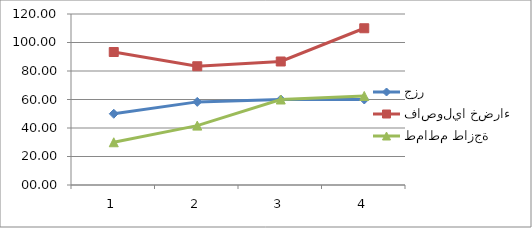
| Category | جزر | فاصوليا خضراء | طماطم طازجة |
|---|---|---|---|
| 0 | 50 | 93.33 | 30 |
| 1 | 58.33 | 83.33 | 41.67 |
| 2 | 60 | 86.67 | 60 |
| 3 | 60 | 110 | 62.5 |